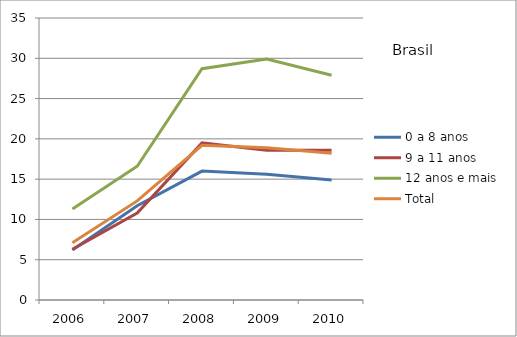
| Category | 0 a 8 anos | 9 a 11 anos | 12 anos e mais | Total |
|---|---|---|---|---|
| 2006.0 | 6.2 | 6.3 | 11.3 | 7.1 |
| 2007.0 | 11.7 | 10.8 | 16.6 | 12.3 |
| 2008.0 | 16 | 19.5 | 28.7 | 19.2 |
| 2009.0 | 15.6 | 18.6 | 29.9 | 18.9 |
| 2010.0 | 14.9 | 18.6 | 27.9 | 18.2 |